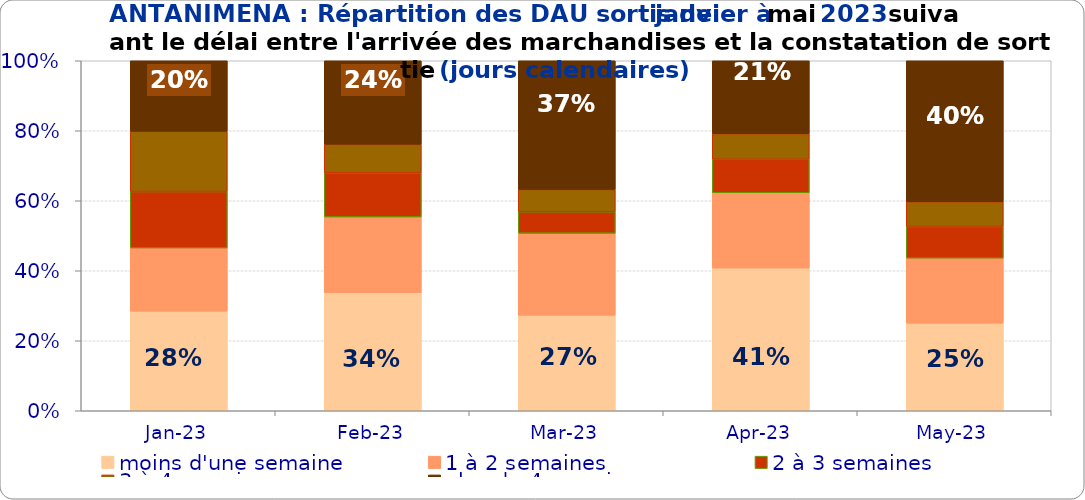
| Category | moins d'une semaine | 1 à 2 semaines | 2 à 3 semaines | 3 à 4 semaines | plus de 4 semaines |
|---|---|---|---|---|---|
| 2023-01-01 | 0.285 | 0.181 | 0.161 | 0.172 | 0.201 |
| 2023-02-01 | 0.338 | 0.216 | 0.126 | 0.082 | 0.238 |
| 2023-03-01 | 0.273 | 0.235 | 0.061 | 0.064 | 0.368 |
| 2023-04-01 | 0.408 | 0.215 | 0.096 | 0.073 | 0.208 |
| 2023-05-01 | 0.25 | 0.186 | 0.09 | 0.071 | 0.403 |